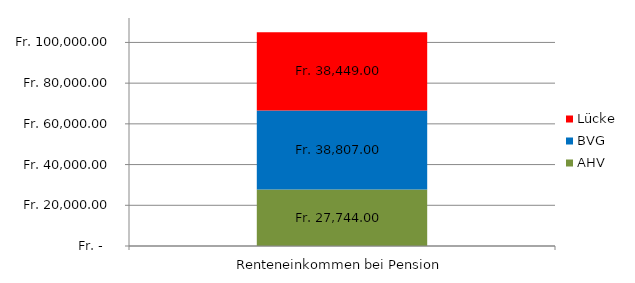
| Category | AHV | BVG | Lücke |
|---|---|---|---|
| 0 | 27744 | 38807 | 38449 |